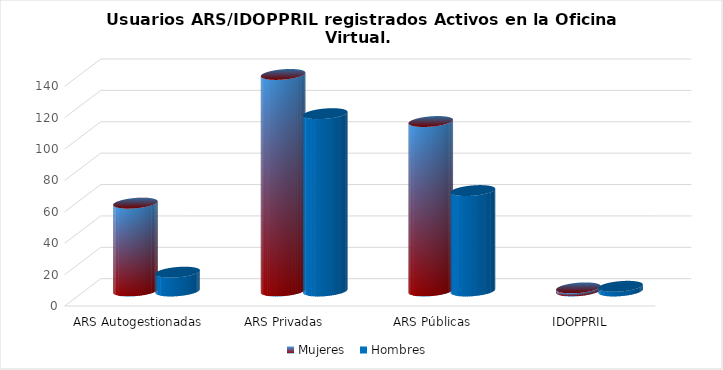
| Category | Mujeres | Hombres |
|---|---|---|
| ARS Autogestionadas | 56 | 12 |
| ARS Privadas | 138 | 113 |
| ARS Públicas | 108 | 64 |
| IDOPPRIL | 2 | 3 |